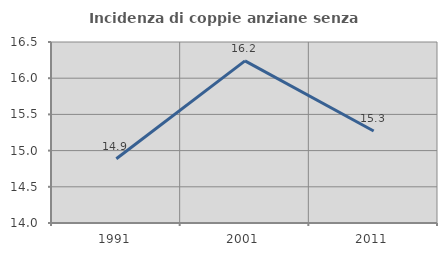
| Category | Incidenza di coppie anziane senza figli  |
|---|---|
| 1991.0 | 14.887 |
| 2001.0 | 16.239 |
| 2011.0 | 15.271 |